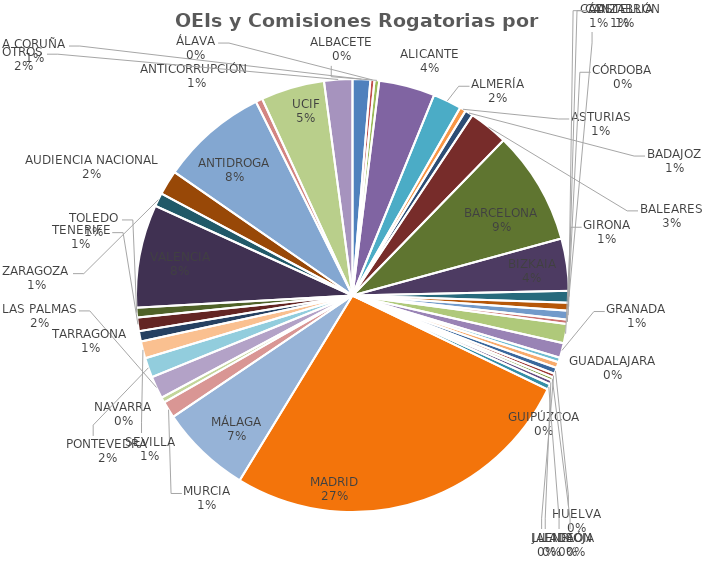
| Category | OEIs y Comisiones Rogatorias |
|---|---|
| A CORUÑA | 60 |
| ÁLAVA | 14 |
| ALBACETE | 16 |
| ALICANTE | 190 |
| ALMERÍA | 97 |
| ASTURIAS | 21 |
| BADAJOZ | 27 |
| BALEARES | 134 |
| BARCELONA | 386 |
| BIZKAIA | 177 |
| CÁDIZ | 40 |
| CANTABRIA | 27 |
| CASTELLÓN | 30 |
| CÓRDOBA | 15 |
| GIRONA | 65 |
| GRANADA | 50 |
| GUADALAJARA | 16 |
| GUIPÚZCOA | 20 |
| HUELVA | 21 |
| JAEN | 13 |
| LEÓN | 11 |
| LLEIDA | 14 |
| LA RIOJA | 19 |
| MADRID | 1210 |
| MÁLAGA | 310 |
| MURCIA | 57 |
| NAVARRA | 18 |
| LAS PALMAS | 76 |
| PONTEVEDRA | 67 |
| SEVILLA | 58 |
| TARRAGONA | 35 |
| TENERIFE | 46 |
| TOLEDO | 33 |
| VALENCIA | 350 |
| ZARAGOZA | 46 |
| AUDIENCIA NACIONAL | 84 |
| ANTIDROGA | 364 |
| ANTICORRUPCIÓN  | 23 |
| UCIF | 216 |
| OTROS | 96 |